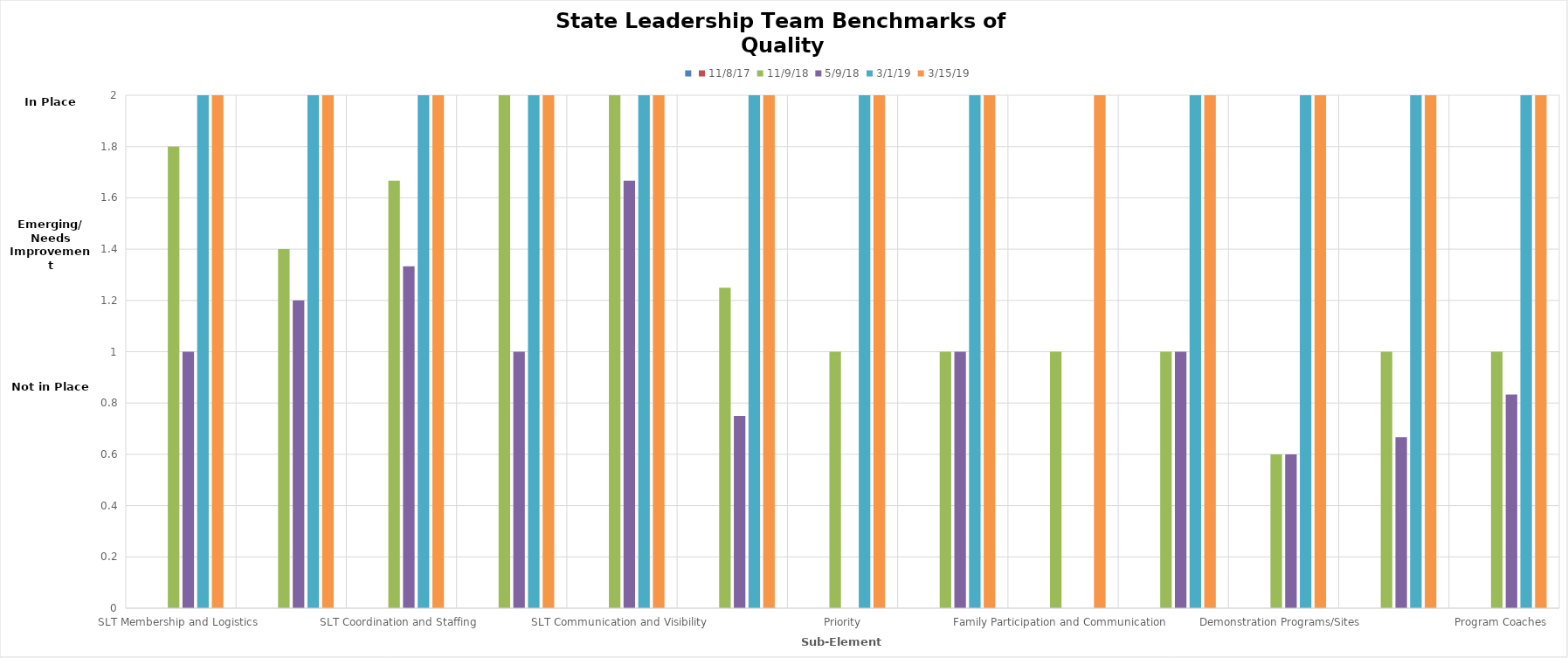
| Category | Series 0 | 11/8/17 | 11/9/18 | 5/9/18 | 3/1/19 | 3/15/19 |
|---|---|---|---|---|---|---|
| SLT Membership and Logistics  | 0 | 0 | 1.8 | 1 | 2 | 2 |
| Action Planning  | 0 | 0 | 1.4 | 1.2 | 2 | 2 |
| SLT Coordination and Staffing  | 0 | 0 | 1.667 | 1.333 | 2 | 2 |
| SLT Funding  | 0 | 0 | 2 | 1 | 2 | 2 |
| SLT Communication and Visibility  | 0 | 0 | 2 | 1.667 | 2 | 2 |
| Authority, Priority, and Communication Linkages  | 0 | 0 | 1.25 | 0.75 | 2 | 2 |
| Family Participation and Communication  | 0 | 0 | 1 | 0 | 2 | 2 |
| Implementation Programs/Sites  | 0 | 0 | 1 | 1 | 2 | 2 |
| Demonstration Programs/Sites  | 0 | 0 | 1 | 0 | 0 | 2 |
| Implementation Communities  | 0 | 0 | 1 | 1 | 2 | 2 |
| Program Coaches  | 0 | 0 | 0.6 | 0.6 | 2 | 2 |
| Ongoing Support and Technical Assistance  | 0 | 0 | 1 | 0.667 | 2 | 2 |
| Data-Based Decision Making  | 0 | 0 | 1 | 0.833 | 2 | 2 |